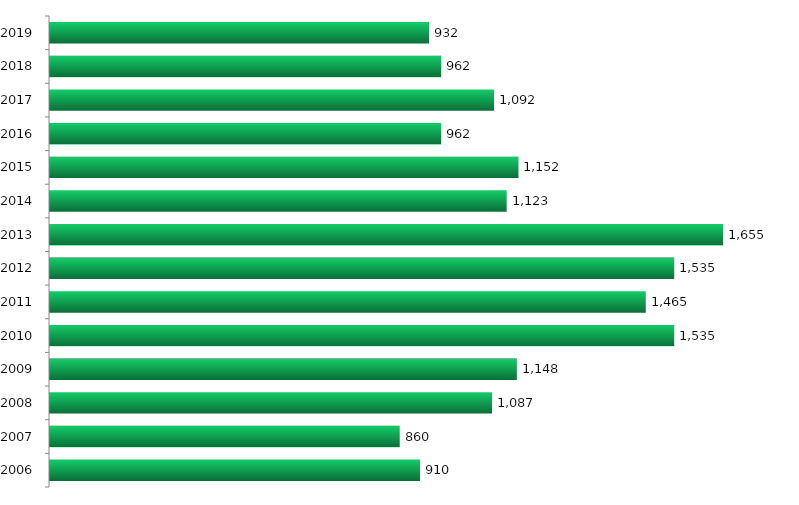
| Category | Vagas |
|---|---|
| 2006.0 | 910 |
| 2007.0 | 860 |
| 2008.0 | 1087 |
| 2009.0 | 1148 |
| 2010.0 | 1535 |
| 2011.0 | 1465 |
| 2012.0 | 1535 |
| 2013.0 | 1655 |
| 2014.0 | 1123 |
| 2015.0 | 1152 |
| 2016.0 | 962 |
| 2017.0 | 1092 |
| 2018.0 | 962 |
| 2019.0 | 932 |